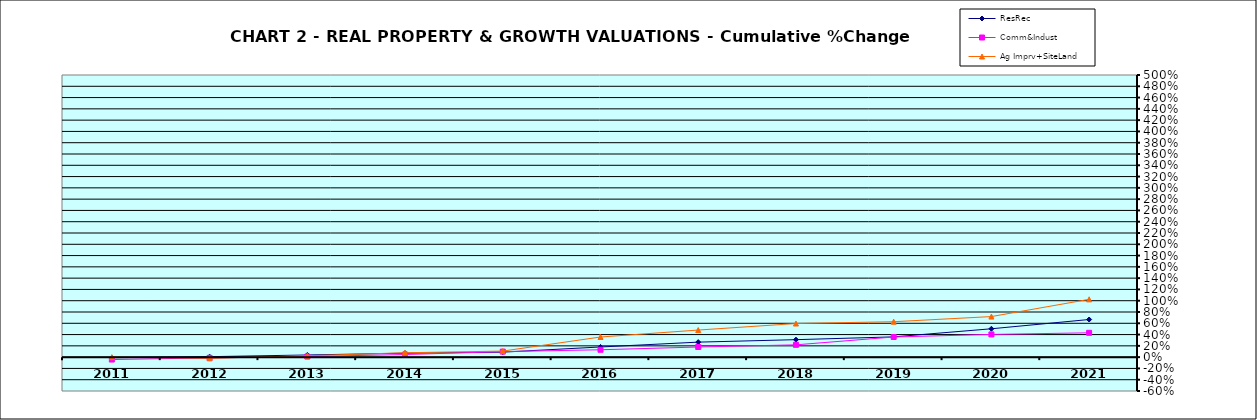
| Category | ResRec | Comm&Indust | Ag Imprv+SiteLand |
|---|---|---|---|
| 2011.0 | -0.01 | -0.043 | 0 |
| 2012.0 | 0.008 | -0.013 | -0.02 |
| 2013.0 | 0.038 | 0.01 | 0.025 |
| 2014.0 | 0.07 | 0.046 | 0.078 |
| 2015.0 | 0.088 | 0.098 | 0.107 |
| 2016.0 | 0.18 | 0.131 | 0.357 |
| 2017.0 | 0.266 | 0.18 | 0.48 |
| 2018.0 | 0.31 | 0.218 | 0.596 |
| 2019.0 | 0.359 | 0.357 | 0.628 |
| 2020.0 | 0.503 | 0.403 | 0.719 |
| 2021.0 | 0.667 | 0.431 | 1.024 |